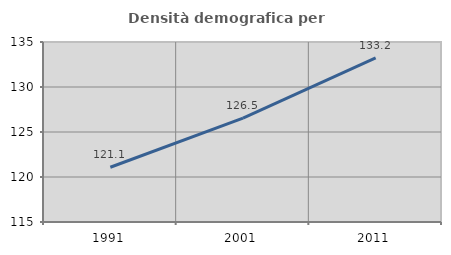
| Category | Densità demografica |
|---|---|
| 1991.0 | 121.083 |
| 2001.0 | 126.543 |
| 2011.0 | 133.236 |